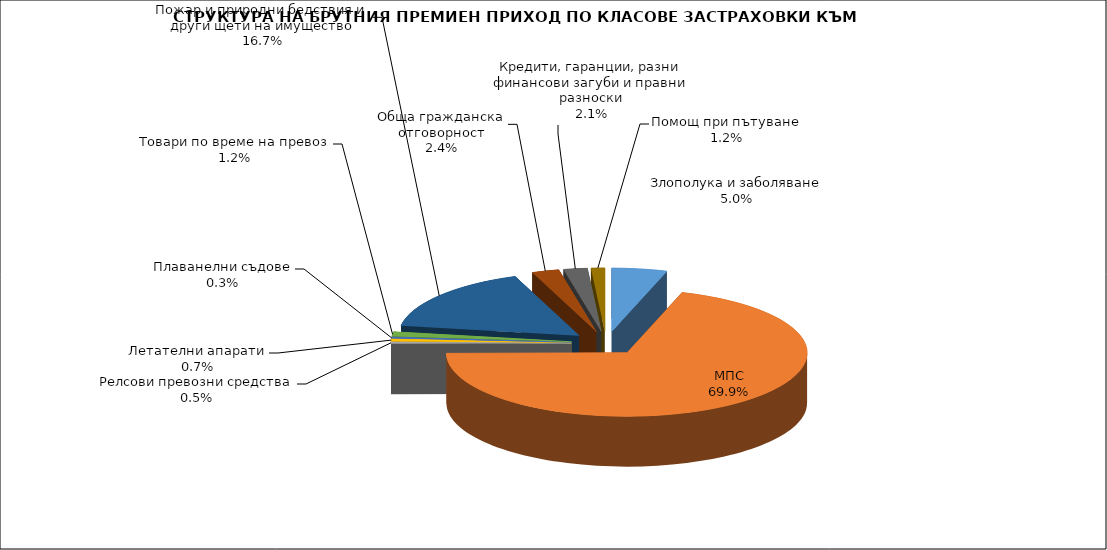
| Category | Злополука и заболяване |
|---|---|
| Злополука и заболяване | 0.05 |
| МПС | 0.699 |
| Релсови превозни средства | 0.005 |
| Летателни апарати | 0.007 |
| Плаванелни съдове | 0.003 |
| Товари по време на превоз | 0.012 |
| Пожар и природни бедствия и други щети на имущество | 0.167 |
| Обща гражданска отговорност | 0.024 |
| Кредити, гаранции, разни финансови загуби и правни разноски | 0.021 |
| Помощ при пътуване | 0.012 |